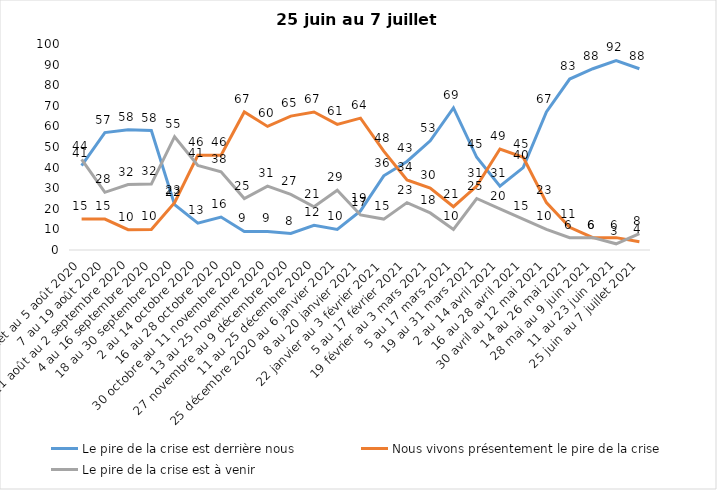
| Category | Le pire de la crise est derrière nous | Nous vivons présentement le pire de la crise | Le pire de la crise est à venir |
|---|---|---|---|
| 24 juillet au 5 août 2020 | 41 | 15 | 44 |
| 7 au 19 août 2020 | 57 | 15 | 28 |
| 21 août au 2 septembre 2020 | 58.39 | 9.84 | 31.77 |
| 4 au 16 septembre 2020 | 58 | 10 | 32 |
| 18 au 30 septembre 2020 | 22 | 23 | 55 |
| 2 au 14 octobre 2020 | 13 | 46 | 41 |
| 16 au 28 octobre 2020 | 16 | 46 | 38 |
| 30 octobre au 11 novembre 2020 | 9 | 67 | 25 |
| 13 au 25 novembre 2020 | 9 | 60 | 31 |
| 27 novembre au 9 décembre 2020 | 8 | 65 | 27 |
| 11 au 25 décembre 2020 | 12 | 67 | 21 |
| 25 décembre 2020 au 6 janvier 2021 | 10 | 61 | 29 |
| 8 au 20 janvier 2021 | 19 | 64 | 17 |
| 22 janvier au 3 février 2021 | 36 | 48 | 15 |
| 5 au 17 février 2021 | 43 | 34 | 23 |
| 19 février au 3 mars 2021 | 53 | 30 | 18 |
| 5 au 17 mars 2021 | 69 | 21 | 10 |
| 19 au 31 mars 2021 | 45 | 31 | 25 |
| 2 au 14 avril 2021 | 31 | 49 | 20 |
| 16 au 28 avril 2021 | 40 | 45 | 15 |
| 30 avril au 12 mai 2021 | 67 | 23 | 10 |
| 14 au 26 mai 2021 | 83 | 11 | 6 |
| 28 mai au 9 juin 2021 | 88 | 6 | 6 |
| 11 au 23 juin 2021 | 92 | 6 | 3 |
| 25 juin au 7 juillet 2021 | 88 | 4 | 8 |